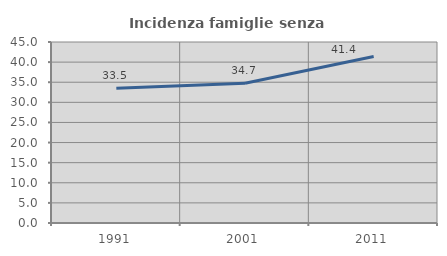
| Category | Incidenza famiglie senza nuclei |
|---|---|
| 1991.0 | 33.48 |
| 2001.0 | 34.739 |
| 2011.0 | 41.373 |